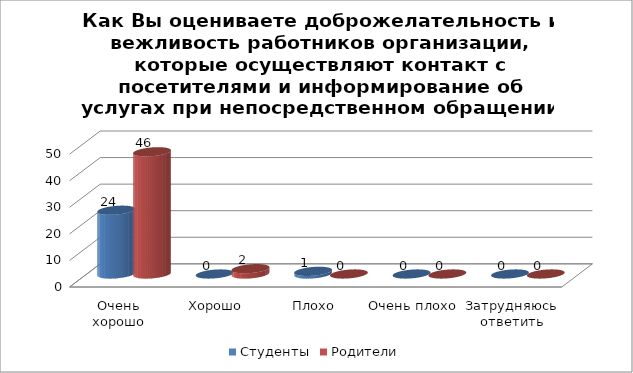
| Category | Студенты | Родители |
|---|---|---|
| Очень хорошо | 24 | 46 |
| Хорошо | 0 | 2 |
| Плохо | 1 | 0 |
| Очень плохо | 0 | 0 |
| Затрудняюсь ответить | 0 | 0 |